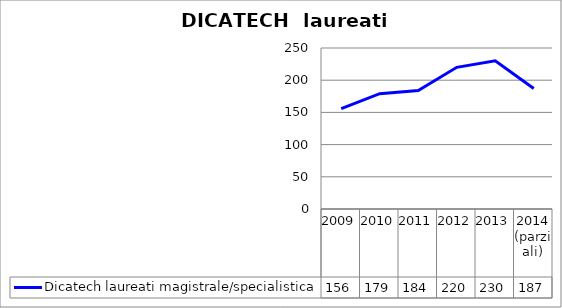
| Category | Dicatech laureati magistrale/specialistica |
|---|---|
| 2009 | 156 |
| 2010 | 179 |
| 2011 | 184 |
| 2012 | 220 |
| 2013 | 230 |
| 2014
(parziali) | 187 |